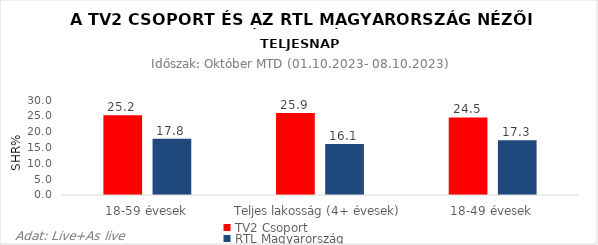
| Category | TV2 Csoport | RTL Magyarország |
|---|---|---|
| 18-59 évesek | 25.2 | 17.8 |
| Teljes lakosság (4+ évesek) | 25.9 | 16.1 |
| 18-49 évesek | 24.5 | 17.3 |